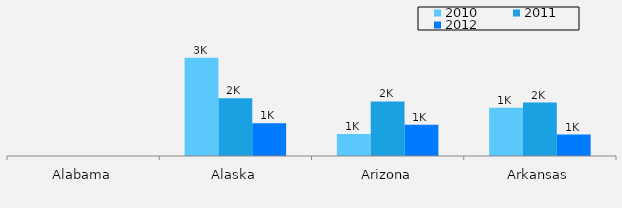
| Category | 2010 | 2011 | 2012 |
|---|---|---|---|
| Alabama | 0 | 0 | 0 |
| Alaska | 3013 | 1771 | 1004 |
| Arizona | 676 | 1677 | 962 |
| Arkansas | 1481 | 1642 | 660 |